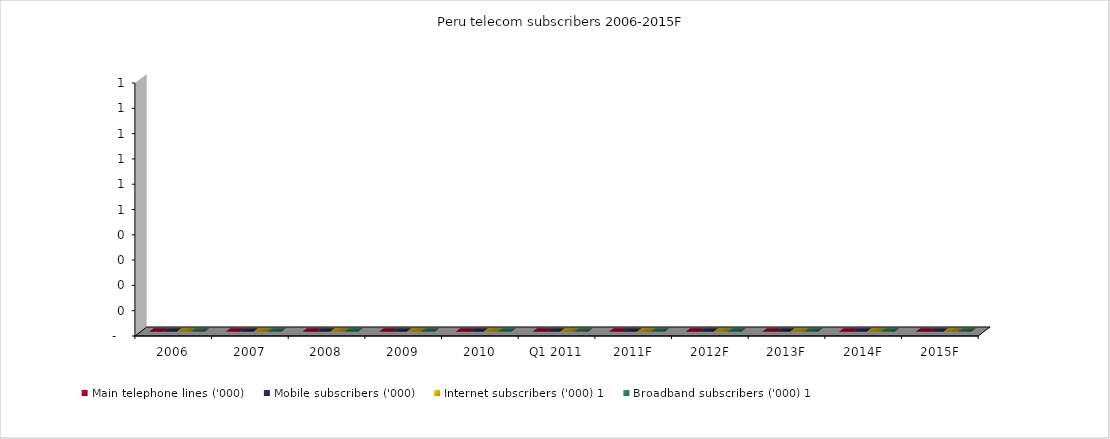
| Category | Main telephone lines ('000) | Mobile subscribers ('000) | Internet subscribers ('000) 1 | Broadband subscribers ('000) 1 |
|---|---|---|---|---|
| 2006 | 0 | 0 | 0 | 0 |
| 2007 | 0 | 0 | 0 | 0 |
| 2008 | 0 | 0 | 0 | 0 |
| 2009 | 0 | 0 | 0 | 0 |
| 2010 | 0 | 0 | 0 | 0 |
| Q1 2011 | 0 | 0 | 0 | 0 |
| 2011F | 0 | 0 | 0 | 0 |
| 2012F | 0 | 0 | 0 | 0 |
| 2013F | 0 | 0 | 0 | 0 |
| 2014F | 0 | 0 | 0 | 0 |
| 2015F | 0 | 0 | 0 | 0 |